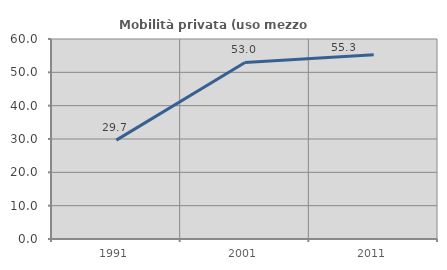
| Category | Mobilità privata (uso mezzo privato) |
|---|---|
| 1991.0 | 29.67 |
| 2001.0 | 52.973 |
| 2011.0 | 55.27 |